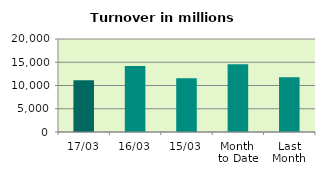
| Category | Series 0 |
|---|---|
| 17/03 | 11142.379 |
| 16/03 | 14208.159 |
| 15/03 | 11584.011 |
| Month 
to Date | 14564.733 |
| Last
Month | 11787.675 |